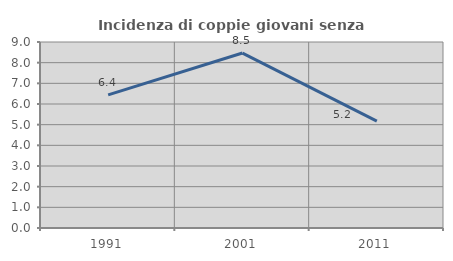
| Category | Incidenza di coppie giovani senza figli |
|---|---|
| 1991.0 | 6.444 |
| 2001.0 | 8.466 |
| 2011.0 | 5.172 |